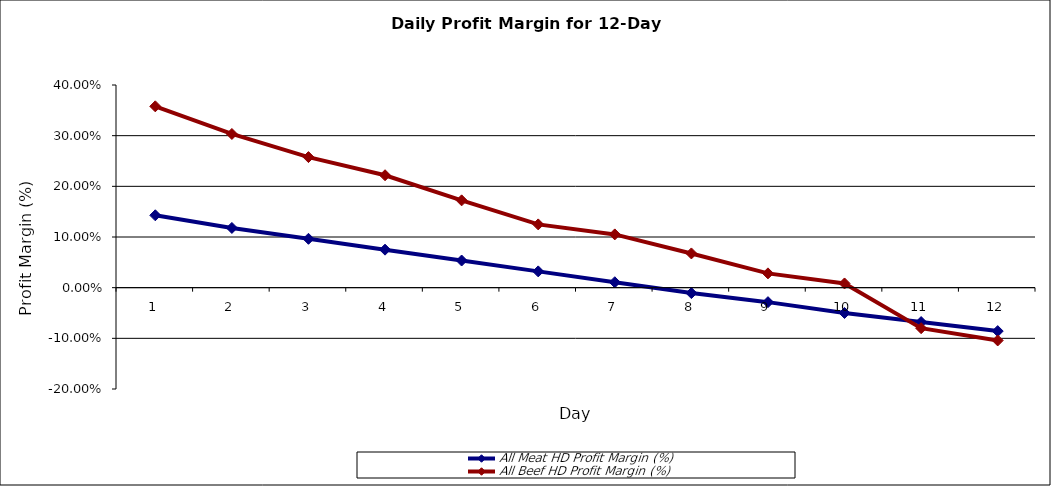
| Category | All Meat HD Profit Margin (%) | All Beef HD Profit Margin (%) |
|---|---|---|
| 0 | 0.143 | 0.215 |
| 1 | 0.118 | 0.185 |
| 2 | 0.096 | 0.161 |
| 3 | 0.075 | 0.147 |
| 4 | 0.054 | 0.119 |
| 5 | 0.032 | 0.093 |
| 6 | 0.011 | 0.094 |
| 7 | -0.011 | 0.068 |
| 8 | -0.029 | 0.028 |
| 9 | -0.05 | 0.008 |
| 10 | -0.068 | -0.012 |
| 11 | -0.086 | -0.018 |